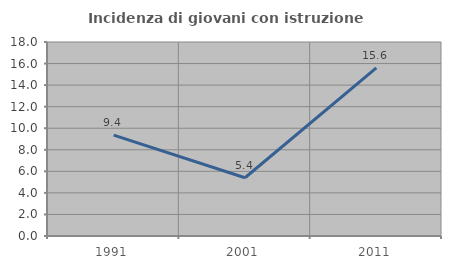
| Category | Incidenza di giovani con istruzione universitaria |
|---|---|
| 1991.0 | 9.357 |
| 2001.0 | 5.405 |
| 2011.0 | 15.603 |